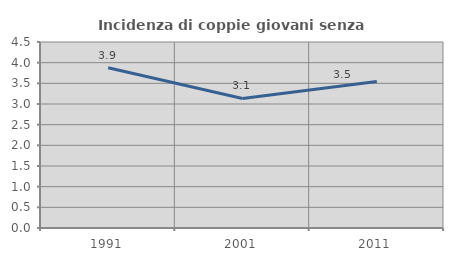
| Category | Incidenza di coppie giovani senza figli |
|---|---|
| 1991.0 | 3.876 |
| 2001.0 | 3.133 |
| 2011.0 | 3.542 |